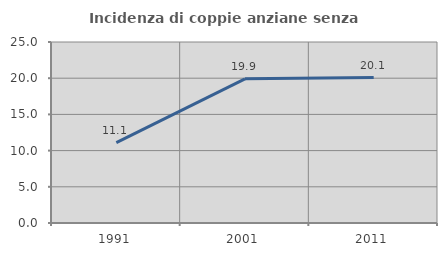
| Category | Incidenza di coppie anziane senza figli  |
|---|---|
| 1991.0 | 11.111 |
| 2001.0 | 19.919 |
| 2011.0 | 20.087 |